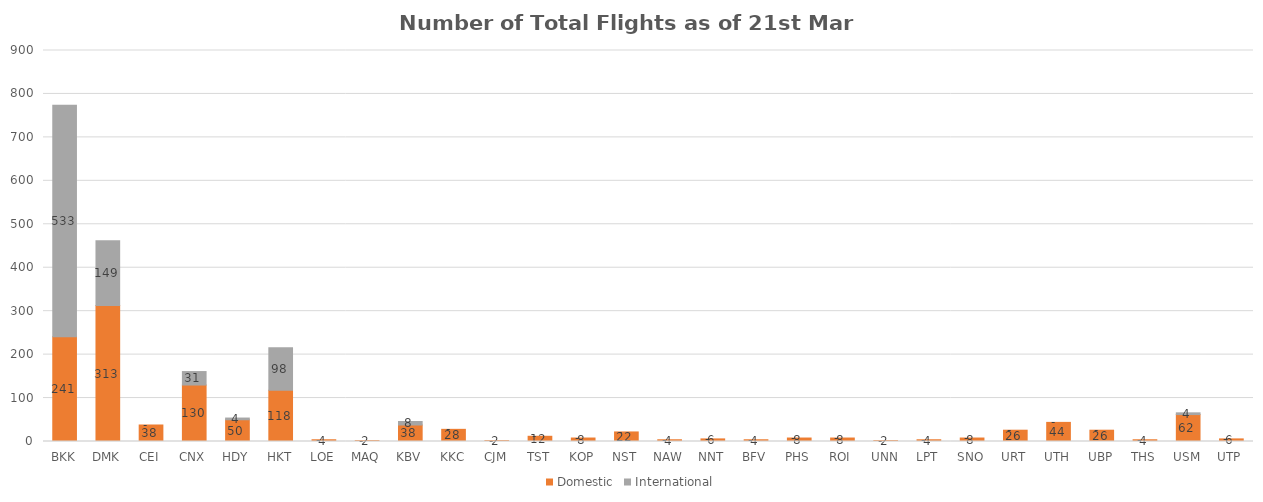
| Category | Domestic | International |
|---|---|---|
| BKK | 241 | 533 |
| DMK | 313 | 149 |
| CEI | 38 | 0 |
| CNX | 130 | 31 |
| HDY | 50 | 4 |
| HKT | 118 | 98 |
| LOE | 4 | 0 |
| MAQ | 2 | 0 |
| KBV | 38 | 8 |
| KKC | 28 | 0 |
| CJM | 2 | 0 |
| TST | 12 | 0 |
| KOP | 8 | 0 |
| NST | 22 | 0 |
| NAW | 4 | 0 |
| NNT | 6 | 0 |
| BFV | 4 | 0 |
| PHS | 8 | 0 |
| ROI | 8 | 0 |
| UNN | 2 | 0 |
| LPT | 4 | 0 |
| SNO | 8 | 0 |
| URT | 26 | 0 |
| UTH | 44 | 0 |
| UBP | 26 | 0 |
| THS | 4 | 0 |
| USM | 62 | 4 |
| UTP | 6 | 0 |